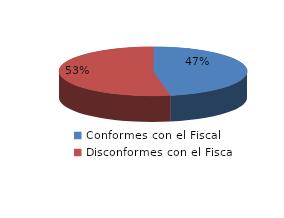
| Category | Series 0 |
|---|---|
| 0 | 32 |
| 1 | 36 |